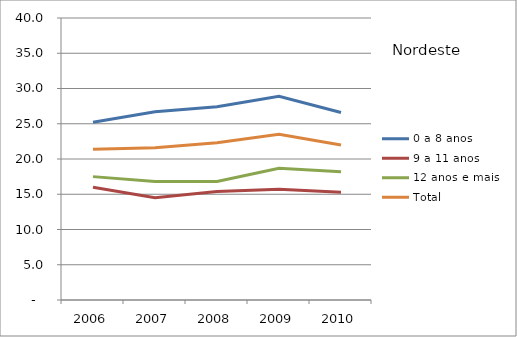
| Category | 0 a 8 anos | 9 a 11 anos | 12 anos e mais | Total |
|---|---|---|---|---|
| 2006.0 | 25.2 | 16 | 17.5 | 21.4 |
| 2007.0 | 26.7 | 14.5 | 16.8 | 21.6 |
| 2008.0 | 27.4 | 15.4 | 16.8 | 22.3 |
| 2009.0 | 28.9 | 15.7 | 18.7 | 23.5 |
| 2010.0 | 26.6 | 15.3 | 18.2 | 22 |